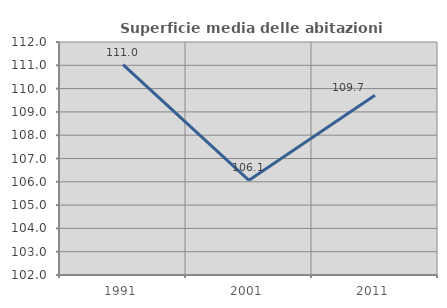
| Category | Superficie media delle abitazioni occupate |
|---|---|
| 1991.0 | 111.025 |
| 2001.0 | 106.064 |
| 2011.0 | 109.717 |